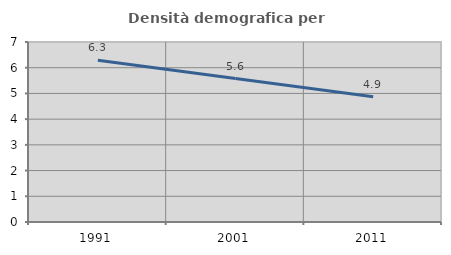
| Category | Densità demografica |
|---|---|
| 1991.0 | 6.286 |
| 2001.0 | 5.577 |
| 2011.0 | 4.868 |